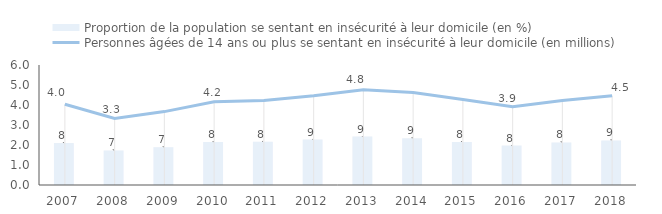
| Category | Proportion de la population se sentant en insécurité à leur domicile (en %) |
|---|---|
| 2007.0 | 8.03 |
| 2008.0 | 6.62 |
| 2009.0 | 7.24 |
| 2010.0 | 8.22 |
| 2011.0 | 8.29 |
| 2012.0 | 8.72 |
| 2013.0 | 9.28 |
| 2014.0 | 8.95 |
| 2015.0 | 8.25 |
| 2016.0 | 7.56 |
| 2017.0 | 8.16 |
| 2018.0 | 8.55 |